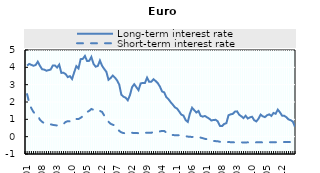
| Category | Long-term interest rate | Short-term interest rate |
|---|---|---|
| 2009-01 | 4.1 | 2.456 |
| 2009-02 | 4.196 | 1.943 |
| 2009-03 | 4.142 | 1.636 |
| 2009-04 | 4.09 | 1.422 |
| 2009-05 | 4.132 | 1.282 |
| 2009-06 | 4.326 | 1.228 |
| 2009-07 | 4.09 | 0.975 |
| 2009-08 | 3.892 | 0.86 |
| 2009-09 | 3.867 | 0.772 |
| 2009-10 | 3.804 | 0.738 |
| 2009-11 | 3.836 | 0.716 |
| 2009-12 | 3.873 | 0.712 |
| 2010-01 | 4.102 | 0.68 |
| 2010-02 | 4.107 | 0.662 |
| 2010-03 | 3.986 | 0.645 |
| 2010-04 | 4.156 | 0.645 |
| 2010-05 | 3.678 | 0.686 |
| 2010-06 | 3.687 | 0.728 |
| 2010-07 | 3.61 | 0.849 |
| 2010-08 | 3.436 | 0.896 |
| 2010-09 | 3.492 | 0.88 |
| 2010-10 | 3.328 | 0.998 |
| 2010-11 | 3.716 | 1.042 |
| 2010-12 | 4.071 | 1.022 |
| 2011-01 | 3.939 | 1.017 |
| 2011-02 | 4.473 | 1.087 |
| 2011-03 | 4.488 | 1.176 |
| 2011-04 | 4.657 | 1.321 |
| 2011-05 | 4.366 | 1.425 |
| 2011-06 | 4.375 | 1.489 |
| 2011-07 | 4.598 | 1.598 |
| 2011-08 | 4.203 | 1.552 |
| 2011-09 | 4.035 | 1.536 |
| 2011-10 | 4.076 | 1.576 |
| 2011-11 | 4.392 | 1.485 |
| 2011-12 | 4.091 | 1.426 |
| 2012-01 | 3.905 | 1.222 |
| 2012-02 | 3.745 | 1.048 |
| 2012-03 | 3.282 | 0.858 |
| 2012-04 | 3.382 | 0.744 |
| 2012-05 | 3.525 | 0.685 |
| 2012-06 | 3.406 | 0.659 |
| 2012-07 | 3.249 | 0.497 |
| 2012-08 | 3.008 | 0.332 |
| 2012-09 | 2.418 | 0.246 |
| 2012-10 | 2.305 | 0.208 |
| 2012-11 | 2.247 | 0.192 |
| 2012-12 | 2.099 | 0.186 |
| 2013-01 | 2.393 | 0.205 |
| 2013-02 | 2.858 | 0.223 |
| 2013-03 | 3.027 | 0.206 |
| 2013-04 | 2.855 | 0.209 |
| 2013-05 | 2.685 | 0.201 |
| 2013-06 | 3.07 | 0.21 |
| 2013-07 | 3.101 | 0.221 |
| 2013-08 | 3.096 | 0.226 |
| 2013-09 | 3.406 | 0.223 |
| 2013-10 | 3.163 | 0.226 |
| 2013-11 | 3.171 | 0.223 |
| 2013-12 | 3.313 | 0.274 |
| 2014-01 | 3.212 | 0.292 |
| 2014-02 | 3.089 | 0.288 |
| 2014-03 | 2.886 | 0.305 |
| 2014-04 | 2.61 | 0.33 |
| 2014-05 | 2.555 | 0.325 |
| 2014-06 | 2.277 | 0.241 |
| 2014-07 | 2.161 | 0.205 |
| 2014-08 | 1.991 | 0.192 |
| 2014-09 | 1.849 | 0.097 |
| 2014-10 | 1.691 | 0.083 |
| 2014-11 | 1.62 | 0.081 |
| 2014-12 | 1.451 | 0.081 |
| 2015-01 | 1.27 | 0.063 |
| 2015-02 | 1.215 | 0.048 |
| 2015-03 | 0.955 | 0.027 |
| 2015-04 | 0.852 | 0.005 |
| 2015-05 | 1.335 | -0.01 |
| 2015-06 | 1.669 | -0.014 |
| 2015-07 | 1.53 | -0.019 |
| 2015-08 | 1.393 | -0.028 |
| 2015-09 | 1.482 | -0.037 |
| 2015-10 | 1.202 | -0.054 |
| 2015-11 | 1.155 | -0.088 |
| 2015-12 | 1.195 | -0.126 |
| 2016-01 | 1.114 | -0.146 |
| 2016-02 | 1.04 | -0.184 |
| 2016-03 | 0.931 | -0.228 |
| 2016-04 | 0.963 | -0.249 |
| 2016-05 | 0.972 | -0.257 |
| 2016-06 | 0.879 | -0.268 |
| 2016-07 | 0.621 | -0.294 |
| 2016-08 | 0.613 | -0.298 |
| 2016-09 | 0.735 | -0.302 |
| 2016-10 | 0.775 | -0.309 |
| 2016-11 | 1.234 | -0.313 |
| 2016-12 | 1.288 | -0.316 |
| 2017-01 | 1.314 | -0.326 |
| 2017-02 | 1.445 | -0.329 |
| 2017-03 | 1.46 | -0.329 |
| 2017-04 | 1.264 | -0.33 |
| 2017-05 | 1.176 | -0.33 |
| 2017-06 | 1.072 | -0.33 |
| 2017-07 | 1.208 | -0.33 |
| 2017-08 | 1.044 | -0.329 |
| 2017-09 | 1.115 | -0.329 |
| 2017-10 | 1.149 | -0.33 |
| 2017-11 | 0.948 | -0.329 |
| 2017-12 | 0.88 | -0.328 |
| 2018-01 | 1.034 | -0.328 |
| 2018-02 | 1.273 | -0.328 |
| 2018-03 | 1.172 | -0.328 |
| 2018-04 | 1.129 | -0.328 |
| 2018-05 | 1.236 | -0.325 |
| 2018-06 | 1.287 | -0.322 |
| 2018-07 | 1.199 | -0.321 |
| 2018-08 | 1.367 | -0.319 |
| 2018-09 | 1.322 | -0.319 |
| 2018-10 | 1.56 | -0.318 |
| 2018-11 | 1.407 | -0.316 |
| 2018-12 | 1.213 | -0.312 |
| 2019-01 | 1.206 | -0.308 |
| 2019-02 | 1.124 | -0.308 |
| 2019-03 | 0.995 | -0.309 |
| 2019-04 | 0.951 | -0.31 |
| 2019-05 | 0.872 | -0.312 |
| 2019-06 | 0.576 | -0.329 |